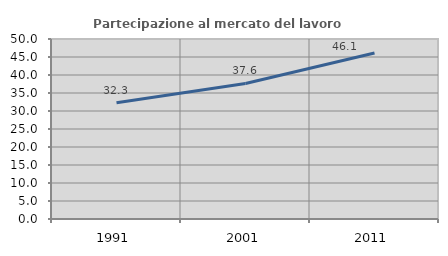
| Category | Partecipazione al mercato del lavoro  femminile |
|---|---|
| 1991.0 | 32.267 |
| 2001.0 | 37.644 |
| 2011.0 | 46.111 |